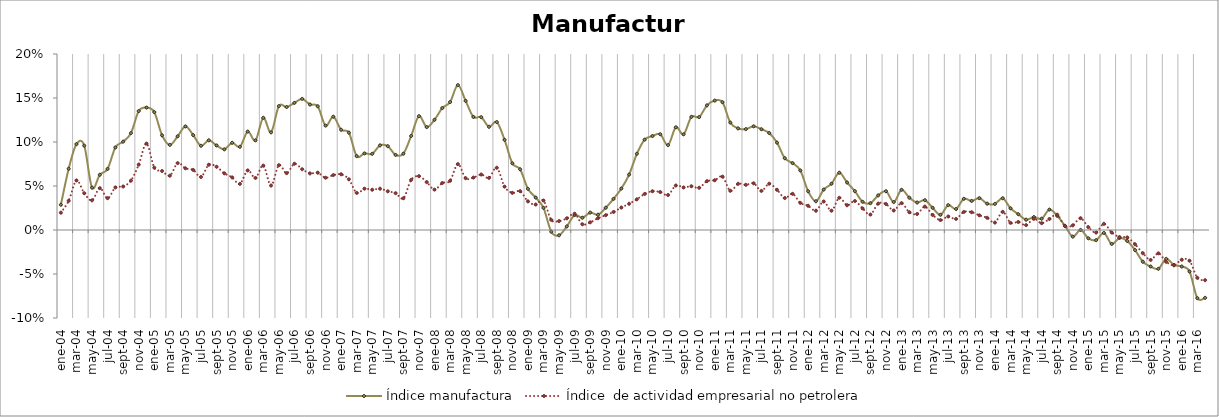
| Category | Índice manufactura | Índice  de actividad empresarial no petrolera |
|---|---|---|
| 2004-01-01 | 0.029 | 0.02 |
| 2004-02-01 | 0.07 | 0.033 |
| 2004-03-01 | 0.098 | 0.056 |
| 2004-04-01 | 0.096 | 0.042 |
| 2004-05-01 | 0.048 | 0.034 |
| 2004-06-01 | 0.063 | 0.048 |
| 2004-07-01 | 0.069 | 0.036 |
| 2004-08-01 | 0.094 | 0.048 |
| 2004-09-01 | 0.1 | 0.049 |
| 2004-10-01 | 0.11 | 0.056 |
| 2004-11-01 | 0.135 | 0.074 |
| 2004-12-01 | 0.139 | 0.098 |
| 2005-01-01 | 0.134 | 0.071 |
| 2005-02-01 | 0.108 | 0.067 |
| 2005-03-01 | 0.097 | 0.062 |
| 2005-04-01 | 0.106 | 0.076 |
| 2005-05-01 | 0.118 | 0.07 |
| 2005-06-01 | 0.108 | 0.068 |
| 2005-07-01 | 0.096 | 0.06 |
| 2005-08-01 | 0.102 | 0.074 |
| 2005-09-01 | 0.096 | 0.072 |
| 2005-10-01 | 0.092 | 0.064 |
| 2005-11-01 | 0.099 | 0.06 |
| 2005-12-01 | 0.095 | 0.052 |
| 2006-01-01 | 0.112 | 0.068 |
| 2006-02-01 | 0.102 | 0.059 |
| 2006-03-01 | 0.127 | 0.073 |
| 2006-04-01 | 0.111 | 0.051 |
| 2006-05-01 | 0.141 | 0.074 |
| 2006-06-01 | 0.14 | 0.065 |
| 2006-07-01 | 0.144 | 0.075 |
| 2006-08-01 | 0.149 | 0.069 |
| 2006-09-01 | 0.143 | 0.064 |
| 2006-10-01 | 0.141 | 0.065 |
| 2006-11-01 | 0.119 | 0.059 |
| 2006-12-01 | 0.129 | 0.062 |
| 2007-01-01 | 0.114 | 0.063 |
| 2007-02-01 | 0.111 | 0.058 |
| 2007-03-01 | 0.084 | 0.042 |
| 2007-04-01 | 0.087 | 0.047 |
| 2007-05-01 | 0.087 | 0.046 |
| 2007-06-01 | 0.096 | 0.047 |
| 2007-07-01 | 0.095 | 0.044 |
| 2007-08-01 | 0.085 | 0.042 |
| 2007-09-01 | 0.087 | 0.036 |
| 2007-10-01 | 0.107 | 0.057 |
| 2007-11-01 | 0.129 | 0.061 |
| 2007-12-01 | 0.117 | 0.054 |
| 2008-01-01 | 0.125 | 0.046 |
| 2008-02-01 | 0.139 | 0.053 |
| 2008-03-01 | 0.145 | 0.056 |
| 2008-04-01 | 0.165 | 0.075 |
| 2008-05-01 | 0.147 | 0.059 |
| 2008-06-01 | 0.128 | 0.06 |
| 2008-07-01 | 0.128 | 0.063 |
| 2008-08-01 | 0.117 | 0.059 |
| 2008-09-01 | 0.123 | 0.071 |
| 2008-10-01 | 0.102 | 0.049 |
| 2008-11-01 | 0.076 | 0.042 |
| 2008-12-01 | 0.069 | 0.044 |
| 2009-01-01 | 0.047 | 0.033 |
| 2009-02-01 | 0.037 | 0.029 |
| 2009-03-01 | 0.025 | 0.033 |
| 2009-04-01 | -0.002 | 0.012 |
| 2009-05-01 | -0.006 | 0.01 |
| 2009-06-01 | 0.004 | 0.013 |
| 2009-07-01 | 0.017 | 0.019 |
| 2009-08-01 | 0.014 | 0.006 |
| 2009-09-01 | 0.02 | 0.009 |
| 2009-10-01 | 0.017 | 0.013 |
| 2009-11-01 | 0.025 | 0.017 |
| 2009-12-01 | 0.035 | 0.02 |
| 2010-01-01 | 0.047 | 0.026 |
| 2010-02-01 | 0.063 | 0.03 |
| 2010-03-01 | 0.087 | 0.035 |
| 2010-04-01 | 0.103 | 0.041 |
| 2010-05-01 | 0.107 | 0.044 |
| 2010-06-01 | 0.109 | 0.043 |
| 2010-07-01 | 0.096 | 0.04 |
| 2010-08-01 | 0.117 | 0.051 |
| 2010-09-01 | 0.109 | 0.048 |
| 2010-10-01 | 0.129 | 0.05 |
| 2010-11-01 | 0.128 | 0.048 |
| 2010-12-01 | 0.142 | 0.055 |
| 2011-01-01 | 0.147 | 0.057 |
| 2011-02-01 | 0.145 | 0.061 |
| 2011-03-01 | 0.122 | 0.045 |
| 2011-04-01 | 0.115 | 0.053 |
| 2011-05-01 | 0.115 | 0.051 |
| 2011-06-01 | 0.118 | 0.053 |
| 2011-07-01 | 0.115 | 0.044 |
| 2011-08-01 | 0.11 | 0.053 |
| 2011-09-01 | 0.099 | 0.046 |
| 2011-10-01 | 0.082 | 0.036 |
| 2011-11-01 | 0.076 | 0.041 |
| 2011-12-01 | 0.068 | 0.031 |
| 2012-01-01 | 0.044 | 0.028 |
| 2012-02-01 | 0.033 | 0.022 |
| 2012-03-01 | 0.046 | 0.032 |
| 2012-04-01 | 0.053 | 0.022 |
| 2012-05-01 | 0.065 | 0.037 |
| 2012-06-01 | 0.054 | 0.028 |
| 2012-07-01 | 0.044 | 0.033 |
| 2012-08-01 | 0.032 | 0.024 |
| 2012-09-01 | 0.031 | 0.018 |
| 2012-10-01 | 0.039 | 0.03 |
| 2012-11-01 | 0.044 | 0.03 |
| 2012-12-01 | 0.032 | 0.022 |
| 2013-01-01 | 0.046 | 0.031 |
| 2013-02-01 | 0.037 | 0.02 |
| 2013-03-01 | 0.031 | 0.018 |
| 2013-04-01 | 0.034 | 0.027 |
| 2013-05-01 | 0.025 | 0.017 |
| 2013-06-01 | 0.017 | 0.011 |
| 2013-07-01 | 0.028 | 0.015 |
| 2013-08-01 | 0.024 | 0.013 |
| 2013-09-01 | 0.035 | 0.021 |
| 2013-10-01 | 0.033 | 0.02 |
| 2013-11-01 | 0.036 | 0.017 |
| 2013-12-01 | 0.03 | 0.014 |
| 2014-01-01 | 0.03 | 0.008 |
| 2014-02-01 | 0.036 | 0.021 |
| 2014-03-01 | 0.025 | 0.008 |
| 2014-04-01 | 0.018 | 0.009 |
| 2014-05-01 | 0.012 | 0.006 |
| 2014-06-01 | 0.015 | 0.013 |
| 2014-07-01 | 0.013 | 0.008 |
| 2014-08-01 | 0.023 | 0.013 |
| 2014-09-01 | 0.016 | 0.017 |
| 2014-10-01 | 0.005 | 0.004 |
| 2014-11-01 | -0.008 | 0.005 |
| 2014-12-01 | 0 | 0.013 |
| 2015-01-01 | -0.009 | 0.003 |
| 2015-02-01 | -0.012 | -0.003 |
| 2015-03-01 | -0.003 | 0.007 |
| 2015-04-01 | -0.016 | -0.003 |
| 2015-05-01 | -0.009 | -0.008 |
| 2015-06-01 | -0.012 | -0.008 |
| 2015-07-01 | -0.023 | -0.016 |
| 2015-08-01 | -0.036 | -0.026 |
| 2015-09-01 | -0.041 | -0.034 |
| 2015-10-01 | -0.044 | -0.027 |
| 2015-11-01 | -0.033 | -0.036 |
| 2015-12-01 | -0.04 | -0.04 |
| 2016-01-01 | -0.041 | -0.034 |
| 2016-02-01 | -0.047 | -0.035 |
| 2016-03-01 | -0.077 | -0.054 |
| 2016-04-01 | -0.077 | -0.057 |